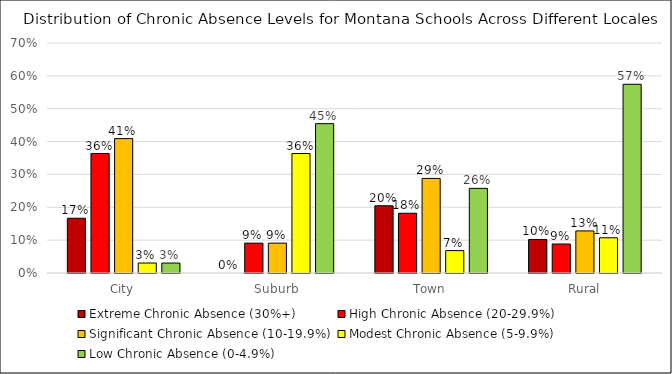
| Category | Extreme Chronic Absence (30%+) | High Chronic Absence (20-29.9%) | Significant Chronic Absence (10-19.9%) | Modest Chronic Absence (5-9.9%) | Low Chronic Absence (0-4.9%) |
|---|---|---|---|---|---|
| City | 0.167 | 0.364 | 0.409 | 0.03 | 0.03 |
| Suburb | 0 | 0.091 | 0.091 | 0.364 | 0.455 |
| Town | 0.205 | 0.182 | 0.288 | 0.068 | 0.258 |
| Rural | 0.102 | 0.088 | 0.128 | 0.107 | 0.574 |